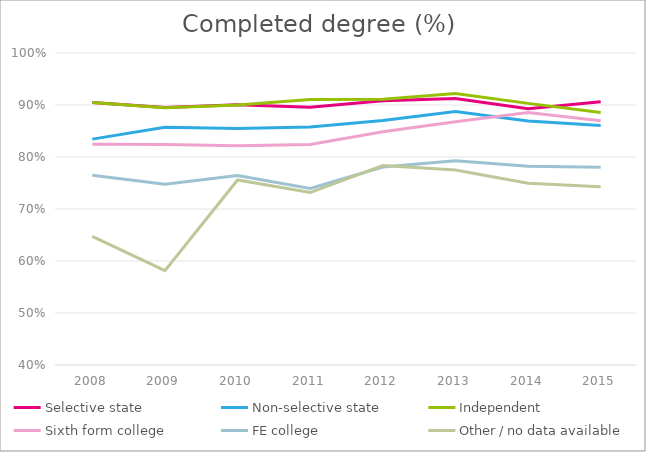
| Category | Selective state | Non-selective state | Independent | Sixth form college | FE college | Other / no data available |
|---|---|---|---|---|---|---|
| 2008.0 | 0.905 | 0.834 | 0.905 | 0.824 | 0.765 | 0.647 |
| 2009.0 | 0.895 | 0.857 | 0.895 | 0.824 | 0.747 | 0.582 |
| 2010.0 | 0.9 | 0.855 | 0.9 | 0.821 | 0.764 | 0.756 |
| 2011.0 | 0.896 | 0.858 | 0.911 | 0.824 | 0.739 | 0.732 |
| 2012.0 | 0.908 | 0.87 | 0.911 | 0.849 | 0.781 | 0.784 |
| 2013.0 | 0.913 | 0.887 | 0.922 | 0.868 | 0.793 | 0.775 |
| 2014.0 | 0.893 | 0.869 | 0.903 | 0.885 | 0.782 | 0.749 |
| 2015.0 | 0.906 | 0.861 | 0.885 | 0.87 | 0.78 | 0.743 |